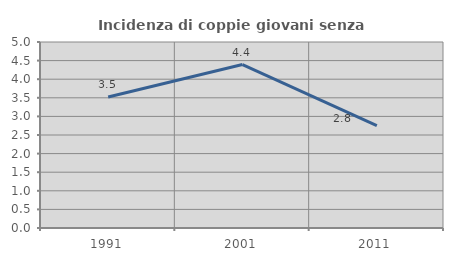
| Category | Incidenza di coppie giovani senza figli |
|---|---|
| 1991.0 | 3.521 |
| 2001.0 | 4.393 |
| 2011.0 | 2.752 |